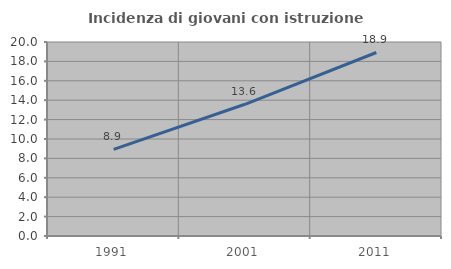
| Category | Incidenza di giovani con istruzione universitaria |
|---|---|
| 1991.0 | 8.929 |
| 2001.0 | 13.58 |
| 2011.0 | 18.919 |